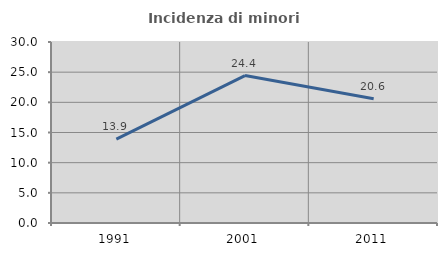
| Category | Incidenza di minori stranieri |
|---|---|
| 1991.0 | 13.889 |
| 2001.0 | 24.434 |
| 2011.0 | 20.594 |